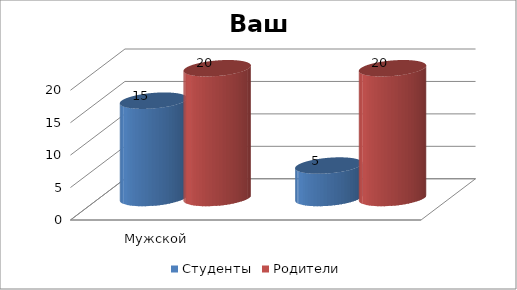
| Category | Студенты | Родители |
|---|---|---|
| Мужской | 15 | 20 |